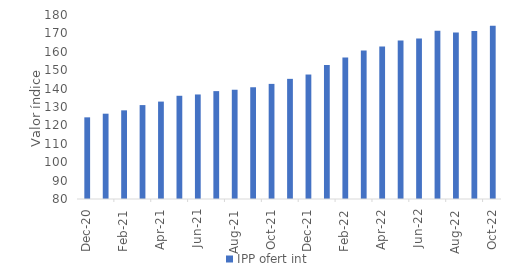
| Category | IPP ofert int |
|---|---|
| 2020-12-01 | 124.38 |
| 2021-01-01 | 126.36 |
| 2021-02-01 | 128.19 |
| 2021-03-01 | 131.04 |
| 2021-04-01 | 132.94 |
| 2021-05-01 | 136.1 |
| 2021-06-01 | 136.81 |
| 2021-07-01 | 138.63 |
| 2021-08-01 | 139.38 |
| 2021-09-01 | 140.73 |
| 2021-10-01 | 142.56 |
| 2021-11-01 | 145.3 |
| 2021-12-01 | 147.65 |
| 2022-01-01 | 152.8 |
| 2022-02-01 | 156.94 |
| 2022-03-01 | 160.65 |
| 2022-04-01 | 162.89 |
| 2022-05-01 | 166.16 |
| 2022-06-01 | 167.21 |
| 2022-07-01 | 171.4 |
| 2022-08-01 | 170.53 |
| 2022-09-01 | 171.26 |
| 2022-10-01 | 174.12 |